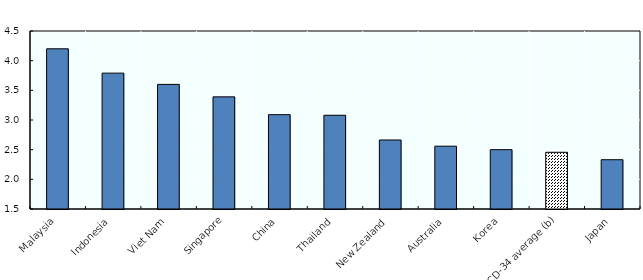
| Category | All households |
|---|---|
| Malaysia | 4.2 |
| Indonesia | 3.79 |
| Viet Nam | 3.6 |
| Singapore | 3.39 |
| China | 3.09 |
| Thailand | 3.08 |
| New Zealand | 2.663 |
| Australia | 2.558 |
| Korea | 2.5 |
| OECD-34 average (b) | 2.456 |
| Japan | 2.331 |